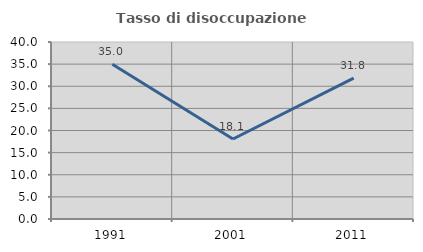
| Category | Tasso di disoccupazione giovanile  |
|---|---|
| 1991.0 | 34.988 |
| 2001.0 | 18.085 |
| 2011.0 | 31.83 |